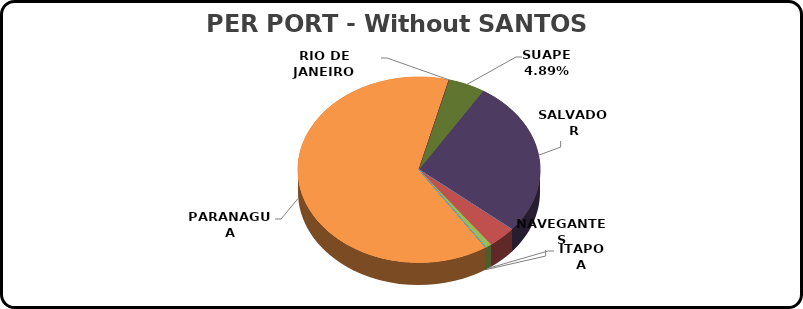
| Category | Series 0 |
|---|---|
| ITAGUAI | 0 |
| ITAJAI | 1069407 |
| ITAPOA | 242230 |
| MANAUS | 0 |
| NAVEGANTES | 0 |
| PARANAGUA | 17928528 |
| RIO DE JANEIRO | 0 |
| RECIFE | 0 |
| SUAPE | 1384320 |
| SALVADOR | 7709622 |
| SAO FRANCISCO DO SUL | 0 |
| RIO GRANDE | 0 |
| VITORIA | 0 |